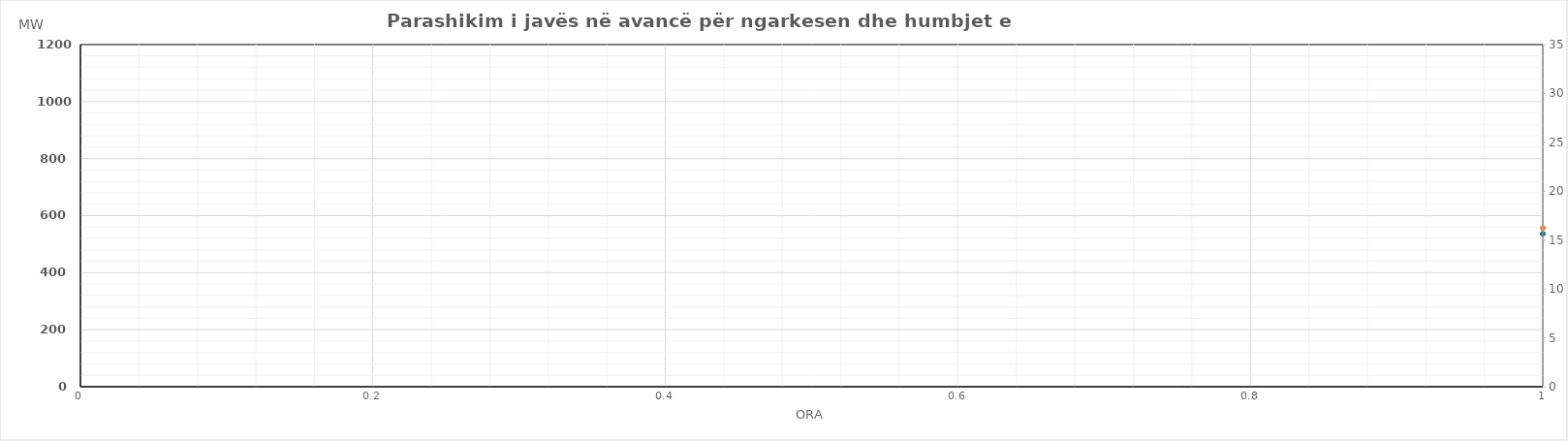
| Category | Ngarkesa (MWh) |
|---|---|
| 0 | 556.21 |
| 1 | 503.15 |
| 2 | 487.7 |
| 3 | 481.69 |
| 4 | 535.98 |
| 5 | 570.19 |
| 6 | 673.84 |
| 7 | 802.41 |
| 8 | 851.54 |
| 9 | 842.11 |
| 10 | 822.41 |
| 11 | 811.39 |
| 12 | 807.04 |
| 13 | 810.66 |
| 14 | 800.9 |
| 15 | 811.78 |
| 16 | 777.28 |
| 17 | 806.85 |
| 18 | 844.43 |
| 19 | 882.82 |
| 20 | 941.04 |
| 21 | 890.84 |
| 22 | 784.89 |
| 23 | 658.18 |
| 24 | 568.71 |
| 25 | 516.15 |
| 26 | 491.67 |
| 27 | 482.08 |
| 28 | 522.09 |
| 29 | 554.97 |
| 30 | 655.88 |
| 31 | 785.13 |
| 32 | 826.24 |
| 33 | 823.72 |
| 34 | 807.58 |
| 35 | 781.74 |
| 36 | 766.43 |
| 37 | 777.03 |
| 38 | 786.91 |
| 39 | 787.03 |
| 40 | 754.27 |
| 41 | 788.6 |
| 42 | 823.77 |
| 43 | 868.64 |
| 44 | 925.16 |
| 45 | 897.98 |
| 46 | 796.42 |
| 47 | 661.95 |
| 48 | 559.26 |
| 49 | 509.42 |
| 50 | 488.98 |
| 51 | 481.05 |
| 52 | 523.42 |
| 53 | 558.01 |
| 54 | 655.78 |
| 55 | 789.15 |
| 56 | 824.14 |
| 57 | 817.56 |
| 58 | 804.61 |
| 59 | 800.18 |
| 60 | 794.85 |
| 61 | 808.85 |
| 62 | 803.18 |
| 63 | 796.9 |
| 64 | 762.35 |
| 65 | 758.51 |
| 66 | 790.58 |
| 67 | 826.22 |
| 68 | 894.23 |
| 69 | 854.63 |
| 70 | 752.64 |
| 71 | 640.51 |
| 72 | 550.24 |
| 73 | 503.31 |
| 74 | 488.03 |
| 75 | 481.84 |
| 76 | 524.26 |
| 77 | 560.74 |
| 78 | 630.48 |
| 79 | 756.43 |
| 80 | 807.45 |
| 81 | 814.36 |
| 82 | 801.64 |
| 83 | 798.75 |
| 84 | 786.58 |
| 85 | 765.06 |
| 86 | 745.9 |
| 87 | 736.83 |
| 88 | 711.15 |
| 89 | 744.47 |
| 90 | 786.39 |
| 91 | 819.01 |
| 92 | 878.12 |
| 93 | 854.12 |
| 94 | 771.9 |
| 95 | 658.54 |
| 96 | 558.54 |
| 97 | 519.55 |
| 98 | 495.22 |
| 99 | 486.27 |
| 100 | 530.45 |
| 101 | 550.44 |
| 102 | 650.3 |
| 103 | 784.06 |
| 104 | 827.17 |
| 105 | 818.05 |
| 106 | 797.96 |
| 107 | 797.53 |
| 108 | 780.9 |
| 109 | 816.61 |
| 110 | 802.19 |
| 111 | 802.09 |
| 112 | 770.78 |
| 113 | 757.41 |
| 114 | 837.95 |
| 115 | 869.06 |
| 116 | 935.65 |
| 117 | 909.36 |
| 118 | 816.88 |
| 119 | 703.88 |
| 120 | 630.65 |
| 121 | 584.01 |
| 122 | 560.86 |
| 123 | 551.31 |
| 124 | 558.59 |
| 125 | 584.1 |
| 126 | 671.62 |
| 127 | 775.39 |
| 128 | 847.69 |
| 129 | 861.07 |
| 130 | 862.45 |
| 131 | 862.26 |
| 132 | 851.64 |
| 133 | 860.18 |
| 134 | 923.65 |
| 135 | 912.31 |
| 136 | 896.49 |
| 137 | 885.21 |
| 138 | 917.94 |
| 139 | 960.5 |
| 140 | 1006.48 |
| 141 | 923.69 |
| 142 | 813.32 |
| 143 | 715.57 |
| 144 | 613.46 |
| 145 | 568.06 |
| 146 | 539.13 |
| 147 | 523.92 |
| 148 | 527.74 |
| 149 | 546.8 |
| 150 | 606 |
| 151 | 714.3 |
| 152 | 802.49 |
| 153 | 856.1 |
| 154 | 862.23 |
| 155 | 861.07 |
| 156 | 859.9 |
| 157 | 790.19 |
| 158 | 757.51 |
| 159 | 744.03 |
| 160 | 733.64 |
| 161 | 777.11 |
| 162 | 807.84 |
| 163 | 868.21 |
| 164 | 934.68 |
| 165 | 888.94 |
| 166 | 779.41 |
| 167 | 673.42 |